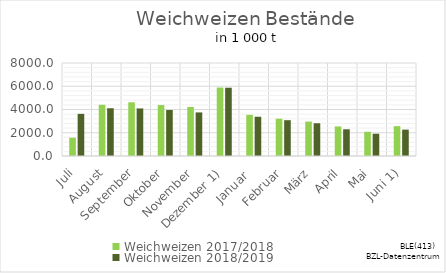
| Category | Weichweizen |
|---|---|
| Juli | 3625.885 |
| August | 4107.77 |
| September | 4091.229 |
| Oktober | 3956.193 |
| November | 3749.172 |
| Dezember 1) | 5872.836 |
| Januar  | 3376.178 |
| Februar | 3079.774 |
| März | 2817.596 |
| April | 2298.545 |
| Mai | 1914.41 |
| Juni 1) | 2268.003 |